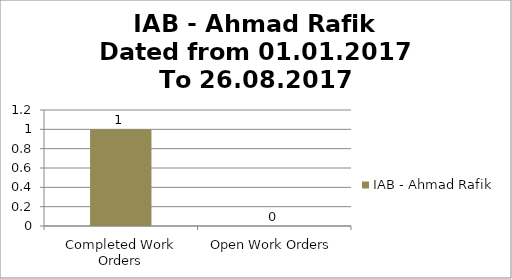
| Category | IAB - Ahmad Rafik |
|---|---|
| Completed Work Orders | 1 |
| Open Work Orders | 0 |